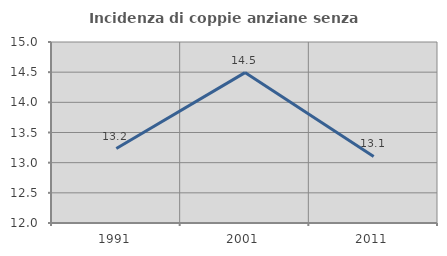
| Category | Incidenza di coppie anziane senza figli  |
|---|---|
| 1991.0 | 13.234 |
| 2001.0 | 14.493 |
| 2011.0 | 13.103 |